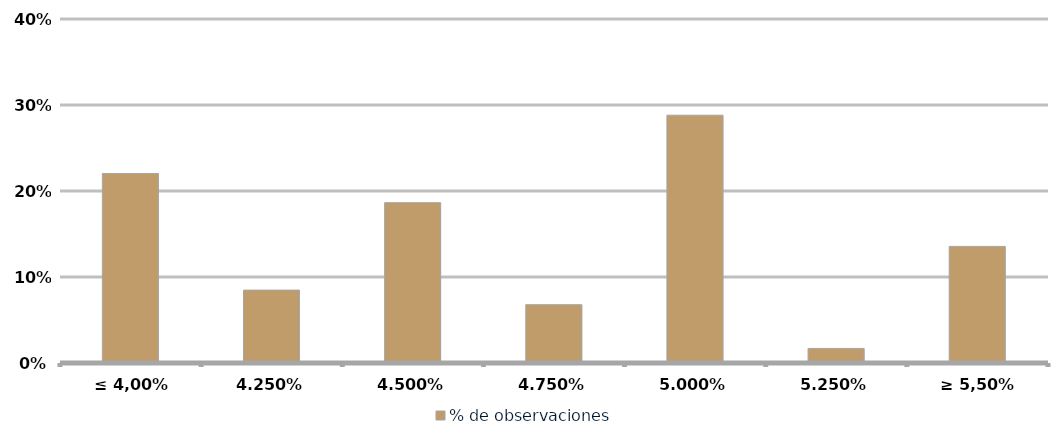
| Category | % de observaciones  |
|---|---|
| ≤ 4,00% | 0.22 |
| 4.25% | 0.085 |
| 4.50% | 0.186 |
| 4.75% | 0.068 |
| 5.00% | 0.288 |
| 5.25% | 0.017 |
| ≥ 5,50% | 0.136 |